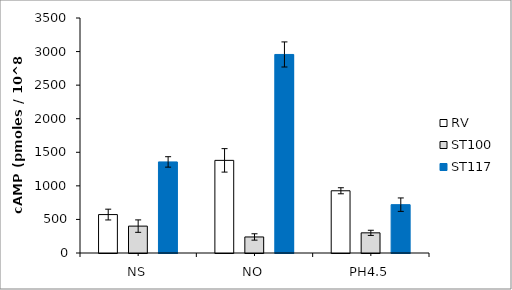
| Category | RV | ST100 | ST117 |
|---|---|---|---|
| NS | 572.365 | 400.381 | 1356.529 |
| NO | 1379.622 | 238.868 | 2957.042 |
| PH4.5 | 926.878 | 300.219 | 719.864 |